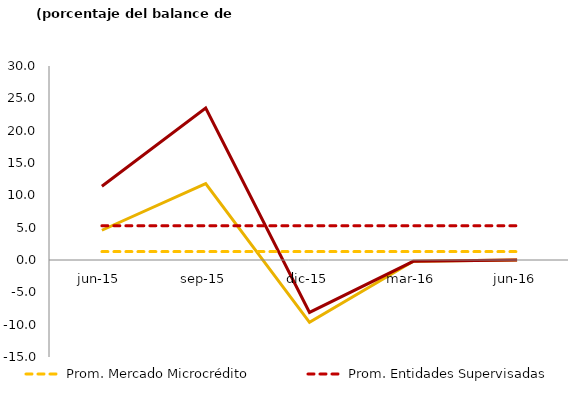
| Category | Mercado de microcrédito | Entidades supervisadas | Prom. Mercado Microcrédito | Prom. Entidades Supervisadas |
|---|---|---|---|---|
| jun-15 | 4.6 | 11.4 | 1.3 | 5.3 |
| sep-15 | 11.8 | 23.5 | 1.3 | 5.3 |
| dic-15 | -9.635 | -8.111 | 1.3 | 5.3 |
| mar-16 | -0.204 | -0.209 | 1.3 | 5.3 |
| jun-16 | -0.014 | -0.008 | 1.3 | 5.3 |